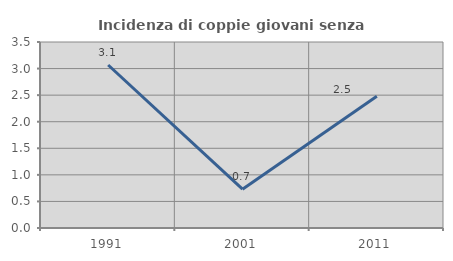
| Category | Incidenza di coppie giovani senza figli |
|---|---|
| 1991.0 | 3.067 |
| 2001.0 | 0.73 |
| 2011.0 | 2.479 |